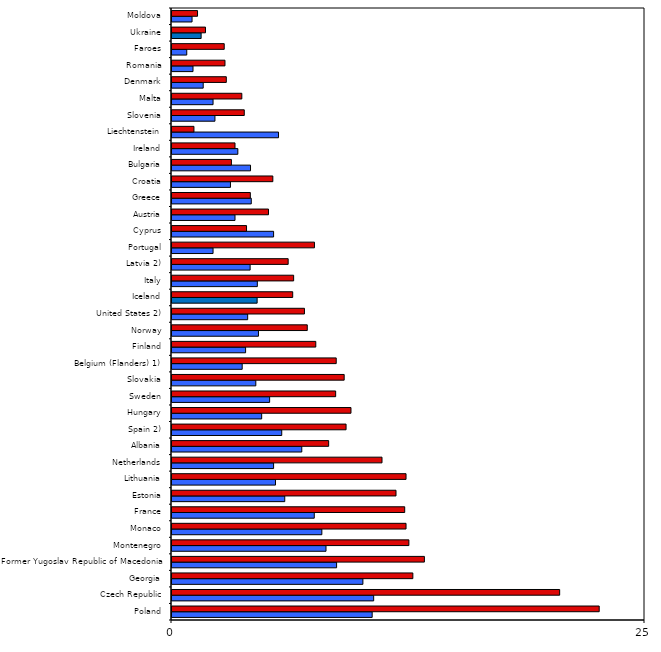
| Category | Boys | Girls |
|---|---|---|
| Poland | 10.58 | 22.58 |
| Czech Republic | 10.66 | 20.49 |
| Georgia | 10.09 | 12.73 |
| Former Yugoslav Republic of Macedonia | 8.7 | 13.34 |
| Montenegro | 8.14 | 12.52 |
| Monaco | 7.92 | 12.37 |
| France | 7.52 | 12.3 |
| Estonia | 5.96 | 11.84 |
| Lithuania | 5.47 | 12.37 |
| Netherlands | 5.37 | 11.1 |
| Albania | 6.86 | 8.28 |
| Spain 2) | 5.8 | 9.2 |
| Hungary | 4.74 | 9.46 |
| Sweden | 5.16 | 8.65 |
| Slovakia | 4.43 | 9.1 |
| Belgium (Flanders) 1) | 3.71 | 8.68 |
| Finland | 3.89 | 7.6 |
| Norway | 4.57 | 7.15 |
| United States 2) | 4 | 7 |
| Iceland | 4.5 | 6.38 |
| Italy | 4.51 | 6.43 |
| Latvia 2) | 4.13 | 6.14 |
| Portugal | 2.17 | 7.53 |
| Cyprus | 5.37 | 3.94 |
| Austria | 3.33 | 5.1 |
| Greece | 4.19 | 4.14 |
| Croatia | 3.09 | 5.33 |
| Bulgaria | 4.15 | 3.14 |
| Ireland | 3.48 | 3.33 |
| Liechtenstein | 5.63 | 1.16 |
| Slovenia | 2.27 | 3.82 |
| Malta | 2.17 | 3.69 |
| Denmark | 1.65 | 2.87 |
| Romania | 1.11 | 2.8 |
| Faroes | 0.78 | 2.76 |
| Ukraine | 1.54 | 1.77 |
| Moldova | 1.06 | 1.35 |